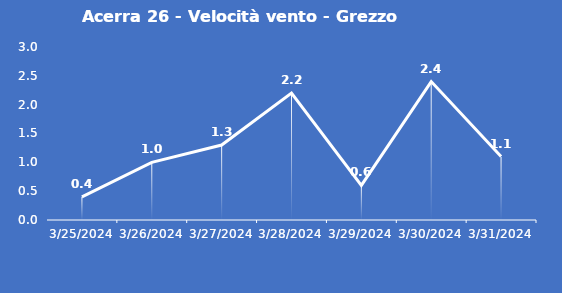
| Category | Acerra 26 - Velocità vento - Grezzo (m/s) |
|---|---|
| 3/25/24 | 0.4 |
| 3/26/24 | 1 |
| 3/27/24 | 1.3 |
| 3/28/24 | 2.2 |
| 3/29/24 | 0.6 |
| 3/30/24 | 2.4 |
| 3/31/24 | 1.1 |